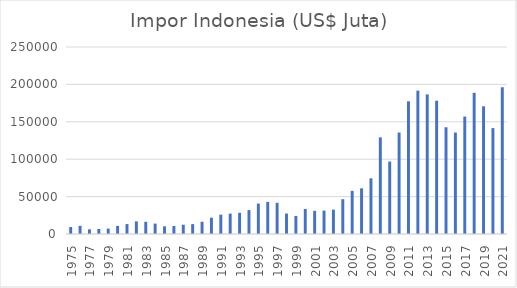
| Category | Impor Indonesia (US$ Juta) |
|---|---|
| 1975.0 | 9331.1 |
| 1976.0 | 10908.5 |
| 1977.0 | 6230.3 |
| 1978.0 | 6690.4 |
| 1979.0 | 7202.3 |
| 1980.0 | 10834.4 |
| 1981.0 | 13272.1 |
| 1982.0 | 16858.9 |
| 1983.0 | 16351.8 |
| 1984.0 | 13882.1 |
| 1985.0 | 10259.1 |
| 1986.0 | 10718.4 |
| 1987.0 | 12370.3 |
| 1988.0 | 13248.5 |
| 1989.0 | 16359.6 |
| 1990.0 | 21837 |
| 1991.0 | 25868.8 |
| 1992.0 | 27279.6 |
| 1993.0 | 28327.8 |
| 1994.0 | 31988.6 |
| 1995.0 | 40654.1 |
| 1996.0 | 42928.6 |
| 1997.0 | 41679.8 |
| 1998.0 | 27336.9 |
| 1999.0 | 24003.3 |
| 2000.0 | 33515 |
| 2001.0 | 30962 |
| 2002.0 | 31289 |
| 2003.0 | 32551 |
| 2004.0 | 46525 |
| 2005.0 | 57701 |
| 2006.0 | 61066 |
| 2007.0 | 74473 |
| 2008.0 | 129197 |
| 2009.0 | 96829 |
| 2010.0 | 135663 |
| 2011.0 | 177436 |
| 2012.0 | 191690 |
| 2013.0 | 186629 |
| 2014.0 | 178179 |
| 2015.0 | 142695 |
| 2016.0 | 135653 |
| 2017.0 | 156986 |
| 2018.0 | 188711 |
| 2019.0 | 170727.7 |
| 2020.0 | 141568.8 |
| 2021.0 | 196190 |